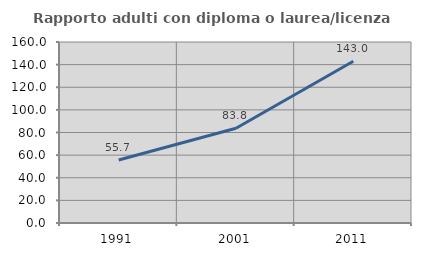
| Category | Rapporto adulti con diploma o laurea/licenza media  |
|---|---|
| 1991.0 | 55.738 |
| 2001.0 | 83.75 |
| 2011.0 | 143.038 |